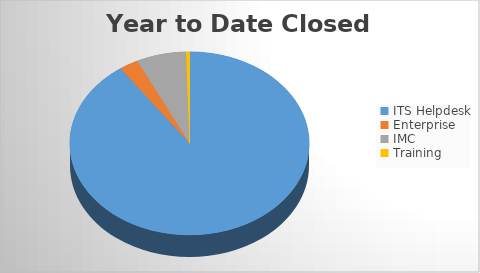
| Category | YTD Closed Tickets | 6M Opened |
|---|---|---|
| ITS Helpdesk | 2674 | 2580 |
| Enterprise | 76 | 39 |
| IMC | 199 | 180 |
| Training | 14 | 11 |